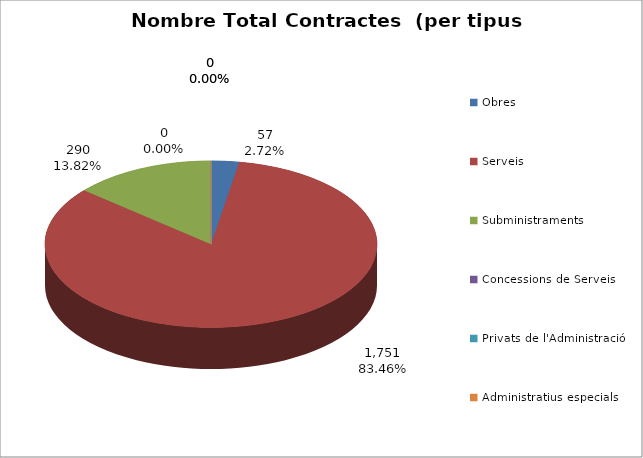
| Category | Nombre Total Contractes |
|---|---|
| Obres | 57 |
| Serveis | 1751 |
| Subministraments | 290 |
| Concessions de Serveis | 0 |
| Privats de l'Administració | 0 |
| Administratius especials | 0 |